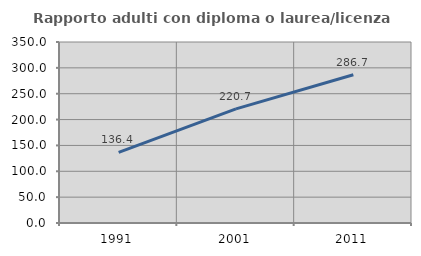
| Category | Rapporto adulti con diploma o laurea/licenza media  |
|---|---|
| 1991.0 | 136.449 |
| 2001.0 | 220.675 |
| 2011.0 | 286.719 |